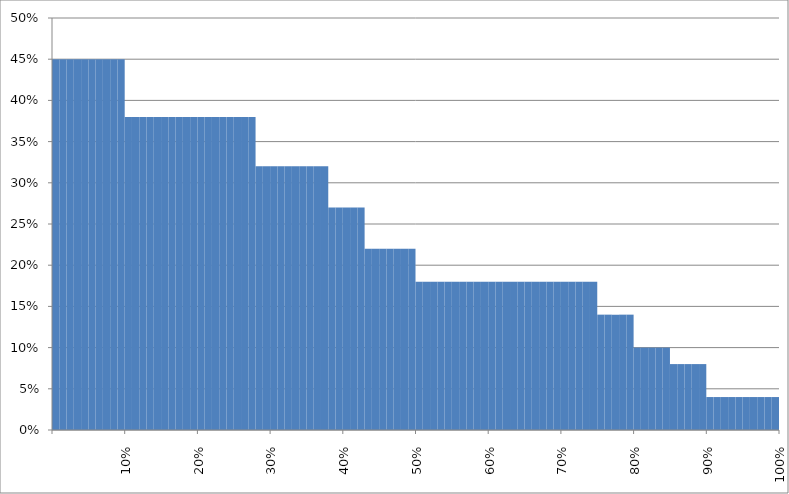
| Category | % Purchased |
|---|---|
|   | 0.45 |
|   | 0.45 |
|   | 0.45 |
|   | 0.45 |
|   | 0.45 |
|   | 0.45 |
|   | 0.45 |
|   | 0.45 |
|   | 0.45 |
| 10% | 0.45 |
|   | 0.38 |
|   | 0.38 |
|   | 0.38 |
|   | 0.38 |
|   | 0.38 |
|   | 0.38 |
|   | 0.38 |
|   | 0.38 |
|   | 0.38 |
| 20% | 0.38 |
|   | 0.38 |
|   | 0.38 |
|   | 0.38 |
|   | 0.38 |
|   | 0.38 |
|   | 0.38 |
|   | 0.38 |
|   | 0.38 |
|   | 0.32 |
| 30% | 0.32 |
|   | 0.32 |
|   | 0.32 |
|   | 0.32 |
|   | 0.32 |
|   | 0.32 |
|   | 0.32 |
|   | 0.32 |
|   | 0.32 |
|   | 0.27 |
| 40% | 0.27 |
|   | 0.27 |
|   | 0.27 |
|   | 0.27 |
|   | 0.22 |
|   | 0.22 |
|   | 0.22 |
|   | 0.22 |
|   | 0.22 |
|   | 0.22 |
| 50% | 0.22 |
|   | 0.18 |
|   | 0.18 |
|   | 0.18 |
|   | 0.18 |
|   | 0.18 |
|   | 0.18 |
|   | 0.18 |
|   | 0.18 |
|   | 0.18 |
| 60% | 0.18 |
|   | 0.18 |
|   | 0.18 |
|   | 0.18 |
|   | 0.18 |
|   | 0.18 |
|   | 0.18 |
|   | 0.18 |
|   | 0.18 |
|   | 0.18 |
| 70% | 0.18 |
|   | 0.18 |
|   | 0.18 |
|   | 0.18 |
|   | 0.18 |
|   | 0.18 |
|   | 0.14 |
|   | 0.14 |
|   | 0.14 |
|   | 0.14 |
| 80% | 0.14 |
|   | 0.1 |
|   | 0.1 |
|   | 0.1 |
|   | 0.1 |
|   | 0.1 |
|   | 0.08 |
|   | 0.08 |
|   | 0.08 |
|   | 0.08 |
| 90% | 0.08 |
|   | 0.04 |
|   | 0.04 |
|   | 0.04 |
|   | 0.04 |
|   | 0.04 |
|   | 0.04 |
|   | 0.04 |
|   | 0.04 |
|   | 0.04 |
| 100% | 0.04 |